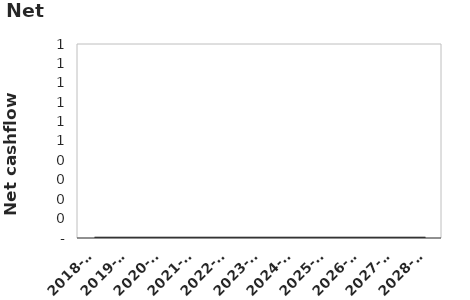
| Category | Series 2 | Series 0 |
|---|---|---|
| 2018-19 | 0 | 0 |
| 2019-20 | 0 | 0 |
| 2020-21 | 0 | 0 |
| 2021-22 | 0 | 0 |
| 2022-23 | 0 | 0 |
| 2023-24 | 0 | 0 |
| 2024-25 | 0 | 0 |
| 2025-26 | 0 | 0 |
| 2026-27 | 0 | 0 |
| 2027-28 | 0 | 0 |
| 2028-29 | 0 | 0 |